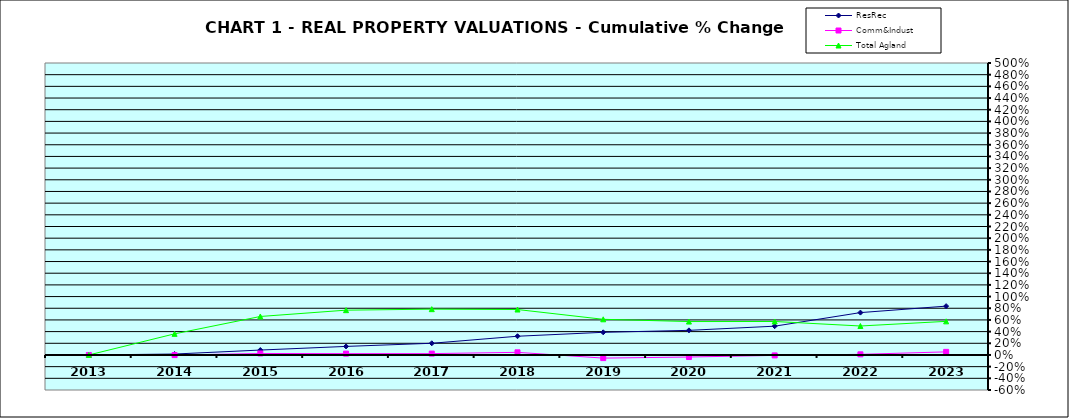
| Category | ResRec | Comm&Indust | Total Agland |
|---|---|---|---|
| 2013.0 | 0 | 0 | 0 |
| 2014.0 | 0.016 | -0.002 | 0.362 |
| 2015.0 | 0.084 | 0.026 | 0.659 |
| 2016.0 | 0.146 | 0.023 | 0.767 |
| 2017.0 | 0.2 | 0.023 | 0.784 |
| 2018.0 | 0.321 | 0.045 | 0.778 |
| 2019.0 | 0.388 | -0.054 | 0.611 |
| 2020.0 | 0.422 | -0.035 | 0.572 |
| 2021.0 | 0.493 | -0.008 | 0.573 |
| 2022.0 | 0.726 | 0.011 | 0.496 |
| 2023.0 | 0.836 | 0.053 | 0.576 |